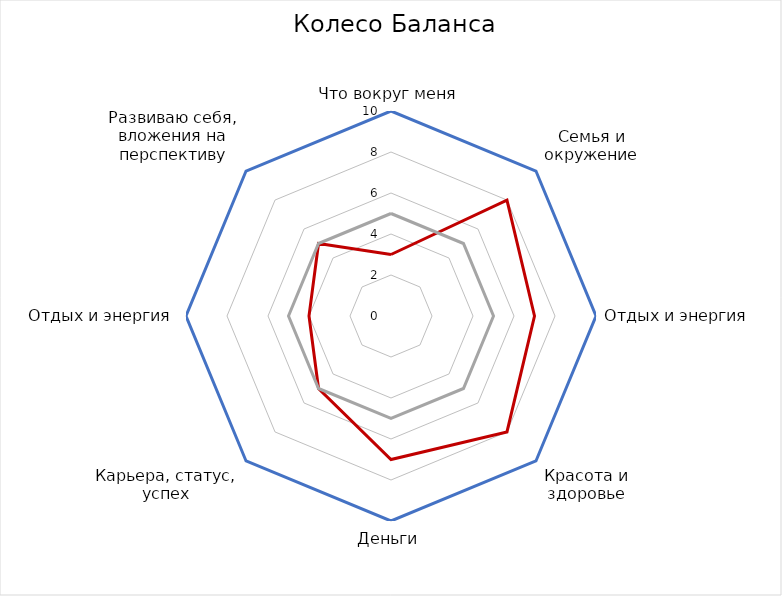
| Category | Series 0 | Series 1 | Series 2 |
|---|---|---|---|
| Что вокруг меня | 3 | 10 | 5 |
| Семья и окружение | 8 | 10 | 5 |
| Отдых и энергия | 7 | 10 | 5 |
| Красота и здоровье | 8 | 10 | 5 |
| Деньги | 7 | 10 | 5 |
| Карьера, статус, успех | 5 | 10 | 5 |
| Отдых и энергия | 4 | 10 | 5 |
| Развиваю себя, вложения на перспективу | 5 | 10 | 5 |